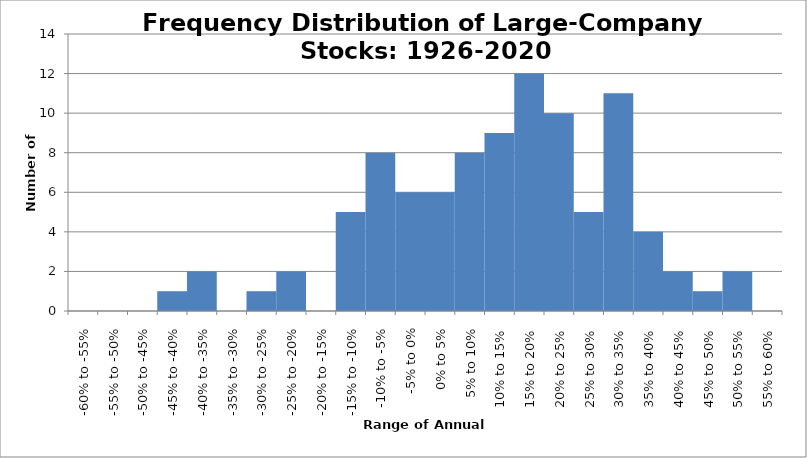
| Category | Series 0 |
|---|---|
| -60% to -55% | 0 |
| -55% to -50% | 0 |
| -50% to -45% | 0 |
| -45% to -40% | 1 |
| -40% to -35% | 2 |
| -35% to -30% | 0 |
| -30% to -25% | 1 |
| -25% to -20% | 2 |
| -20% to -15% | 0 |
| -15% to -10% | 5 |
| -10% to -5% | 8 |
| -5% to 0% | 6 |
| 0% to 5% | 6 |
| 5% to 10% | 8 |
| 10% to 15% | 9 |
| 15% to 20% | 12 |
| 20% to 25% | 10 |
| 25% to 30% | 5 |
| 30% to 35% | 11 |
| 35% to 40% | 4 |
| 40% to 45% | 2 |
| 45% to 50% | 1 |
| 50% to 55% | 2 |
| 55% to 60% | 0 |